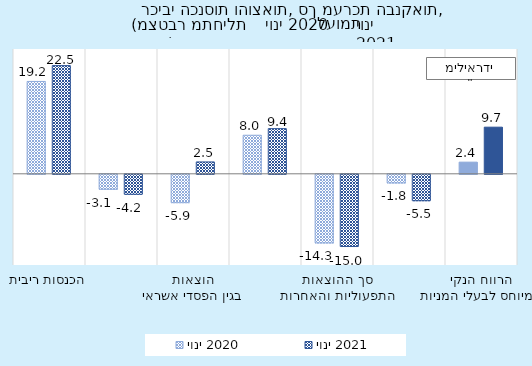
| Category | יוני 2020 | יוני 2021 |
|---|---|---|
| הכנסות ריבית | 19241.9 | 22539.8 |
| הוצאות ריבית | -3111.6 | -4161 |
| הוצאות בגין הפסדי אשראי | -5910.543 | 2472 |
| הכנסות שאינן מריבית | 8034.4 | 9409.7 |
| סך ההוצאות התפעוליות והאחרות | -14295.625 | -15046.9 |
| הפרשה למסים על הרווח וזכויות מיעוט | -1801.121 | -5501.3 |
| הרווח הנקי המיוחס לבעלי המניות | 2427.659 | 9712.3 |